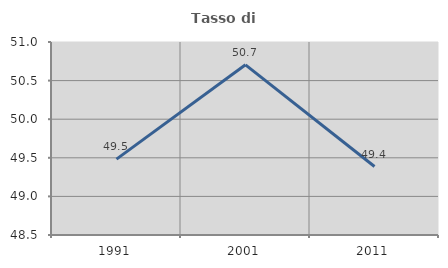
| Category | Tasso di occupazione   |
|---|---|
| 1991.0 | 49.483 |
| 2001.0 | 50.704 |
| 2011.0 | 49.387 |